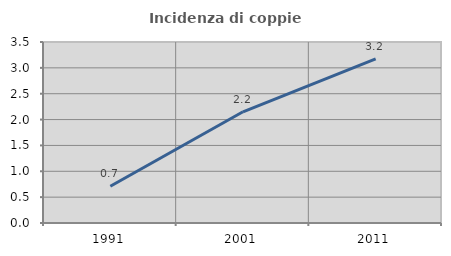
| Category | Incidenza di coppie miste |
|---|---|
| 1991.0 | 0.71 |
| 2001.0 | 2.15 |
| 2011.0 | 3.174 |